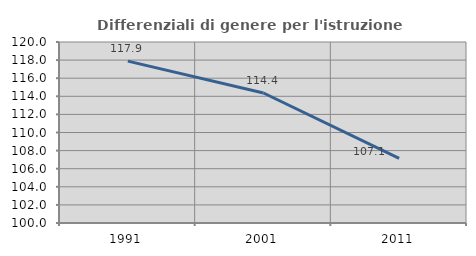
| Category | Differenziali di genere per l'istruzione superiore |
|---|---|
| 1991.0 | 117.887 |
| 2001.0 | 114.366 |
| 2011.0 | 107.145 |